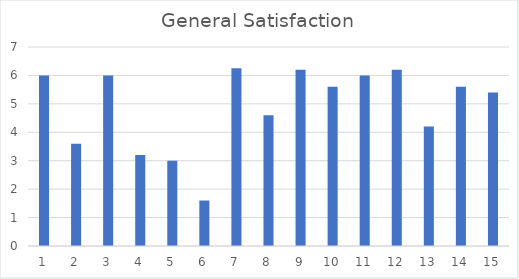
| Category | General Satisfaction |
|---|---|
| 0 | 6 |
| 1 | 3.6 |
| 2 | 6 |
| 3 | 3.2 |
| 4 | 3 |
| 5 | 1.6 |
| 6 | 6.25 |
| 7 | 4.6 |
| 8 | 6.2 |
| 9 | 5.6 |
| 10 | 6 |
| 11 | 6.2 |
| 12 | 4.2 |
| 13 | 5.6 |
| 14 | 5.4 |